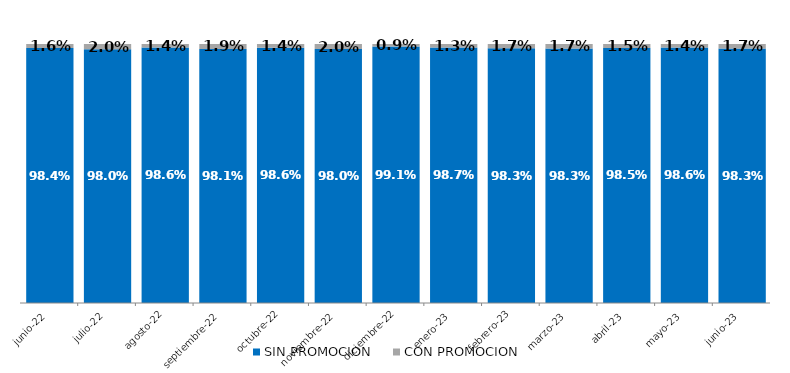
| Category | SIN PROMOCION   | CON PROMOCION   |
|---|---|---|
| 2022-06-01 | 0.984 | 0.016 |
| 2022-07-01 | 0.98 | 0.02 |
| 2022-08-01 | 0.986 | 0.014 |
| 2022-09-01 | 0.981 | 0.019 |
| 2022-10-01 | 0.986 | 0.014 |
| 2022-11-01 | 0.98 | 0.02 |
| 2022-12-01 | 0.991 | 0.009 |
| 2023-01-01 | 0.987 | 0.013 |
| 2023-02-01 | 0.983 | 0.017 |
| 2023-03-01 | 0.983 | 0.017 |
| 2023-04-01 | 0.985 | 0.015 |
| 2023-05-01 | 0.986 | 0.014 |
| 2023-06-01 | 0.983 | 0.017 |